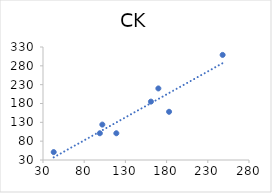
| Category | Series 0 |
|---|---|
| 161.0 | 185 |
| 99.0 | 101 |
| 248.0 | 309 |
| 183.0 | 158 |
| 102.0 | 124 |
| 43.0 | 51 |
| 170.0 | 220 |
| 119.0 | 101 |